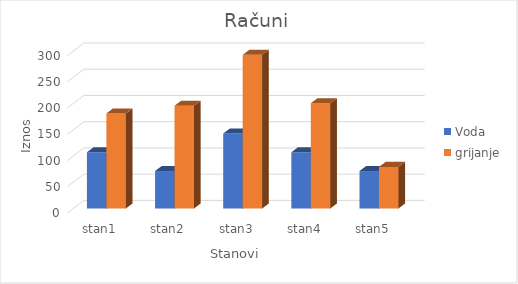
| Category | Voda | grijanje |
|---|---|---|
| stan1 | 107.143 | 181.261 |
| stan2 | 71.429 | 195.826 |
| stan3 | 142.857 | 292.93 |
| stan4 | 107.143 | 200.681 |
| stan5 | 71.429 | 79.302 |